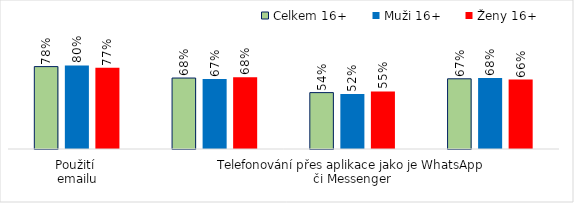
| Category | Celkem 16+ | Muži 16+ | Ženy 16+ |
|---|---|---|---|
| Použití 
emailu | 0.785 | 0.796 | 0.774 |
| Zásílání zpráv přes aplikace jako je WhatsApp či Messenger | 0.676 | 0.667 | 0.684 |
| Telefonování přes aplikace jako je WhatsApp či Messenger | 0.537 | 0.525 | 0.549 |
| Použití internetového bankovnictví | 0.668 | 0.676 | 0.661 |